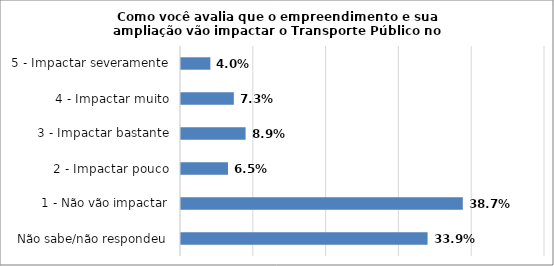
| Category | Series 0 |
|---|---|
| Não sabe/não respondeu | 0.339 |
| 1 - Não vão impactar | 0.387 |
| 2 - Impactar pouco | 0.065 |
| 3 - Impactar bastante | 0.089 |
| 4 - Impactar muito | 0.073 |
| 5 - Impactar severamente | 0.04 |